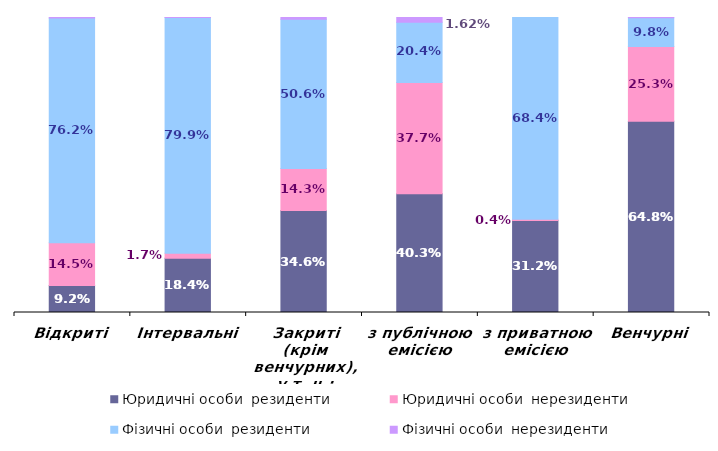
| Category | Юридичні особи  | Фізичні особи  |
|---|---|---|
| Відкриті | 0.145 | 0.002 |
| Інтервальні | 0.017 | 0 |
| Закриті (крім венчурних), у т. ч.: | 0.143 | 0.006 |
| з публічною емісією | 0.377 | 0.016 |
| з приватною емісією | 0.004 | 0 |
| Венчурні | 0.253 | 0.001 |